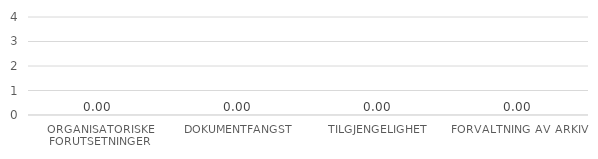
| Category | Series 5 |
|---|---|
| ORGANISATORISKE FORUTSETNINGER | 0 |
| DOKUMENTFANGST | 0 |
| TILGJENGELIGHET | 0 |
| FORVALTNING AV ARKIV | 0 |